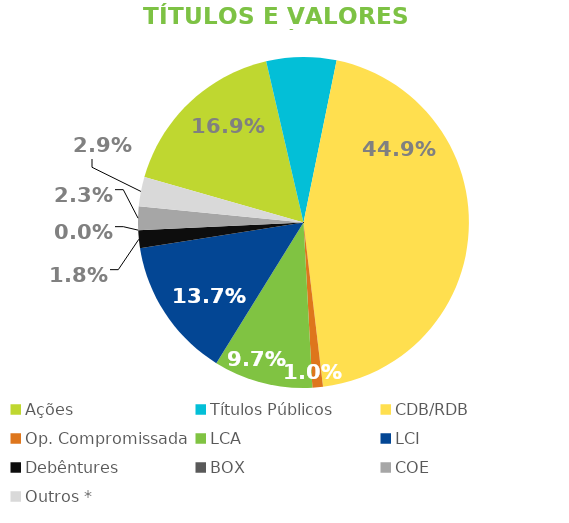
| Category | TVM |
|---|---|
| Ações | 0.169 |
| Títulos Públicos | 0.068 |
| CDB/RDB | 0.449 |
| Op. Compromissada | 0.01 |
| LCA | 0.097 |
| LCI | 0.137 |
| Debêntures | 0.018 |
| BOX | 0 |
| COE | 0.023 |
| Outros * | 0.029 |